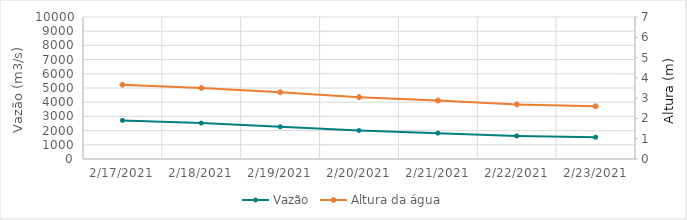
| Category | Vazão |
|---|---|
| 2/17/21 | 2743.66 |
| 2/16/21 | 2906.47 |
| 2/15/21 | 2940.8 |
| 2/14/21 | 3063.69 |
| 2/13/21 | 3227.1 |
| 2/12/21 | 3370.38 |
| 2/11/21 | 3847.72 |